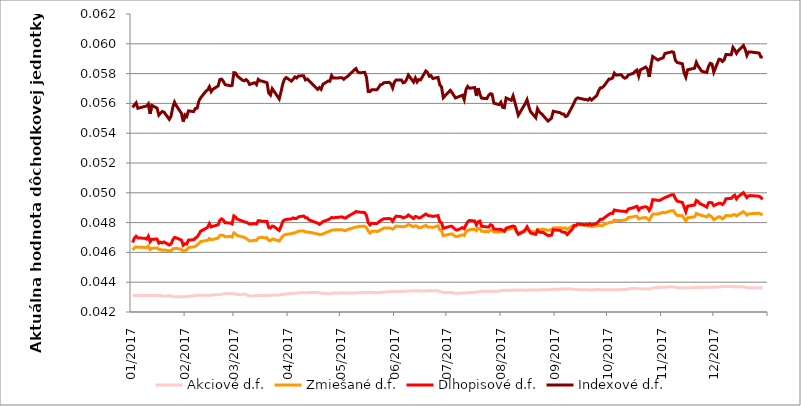
| Category | Akciové d.f. | Zmiešané d.f. | Dlhopisové d.f. | Indexové d.f. |
|---|---|---|---|---|
| 2017-01-02 | 0.043 | 0.046 | 0.047 | 0.056 |
| 2017-01-03 | 0.043 | 0.046 | 0.047 | 0.056 |
| 2017-01-04 | 0.043 | 0.046 | 0.047 | 0.056 |
| 2017-01-05 | 0.043 | 0.046 | 0.047 | 0.056 |
| 2017-01-09 | 0.043 | 0.046 | 0.047 | 0.056 |
| 2017-01-10 | 0.043 | 0.046 | 0.047 | 0.056 |
| 2017-01-11 | 0.043 | 0.046 | 0.047 | 0.056 |
| 2017-01-12 | 0.043 | 0.046 | 0.047 | 0.055 |
| 2017-01-13 | 0.043 | 0.046 | 0.047 | 0.056 |
| 2017-01-16 | 0.043 | 0.046 | 0.047 | 0.056 |
| 2017-01-17 | 0.043 | 0.046 | 0.047 | 0.055 |
| 2017-01-18 | 0.043 | 0.046 | 0.047 | 0.055 |
| 2017-01-19 | 0.043 | 0.046 | 0.047 | 0.055 |
| 2017-01-20 | 0.043 | 0.046 | 0.047 | 0.055 |
| 2017-01-23 | 0.043 | 0.046 | 0.046 | 0.055 |
| 2017-01-24 | 0.043 | 0.046 | 0.047 | 0.055 |
| 2017-01-25 | 0.043 | 0.046 | 0.047 | 0.056 |
| 2017-01-26 | 0.043 | 0.046 | 0.047 | 0.056 |
| 2017-01-27 | 0.043 | 0.046 | 0.047 | 0.056 |
| 2017-01-30 | 0.043 | 0.046 | 0.047 | 0.055 |
| 2017-01-31 | 0.043 | 0.046 | 0.046 | 0.055 |
| 2017-02-01 | 0.043 | 0.046 | 0.047 | 0.055 |
| 2017-02-02 | 0.043 | 0.046 | 0.047 | 0.055 |
| 2017-02-03 | 0.043 | 0.046 | 0.047 | 0.055 |
| 2017-02-06 | 0.043 | 0.046 | 0.047 | 0.055 |
| 2017-02-07 | 0.043 | 0.046 | 0.047 | 0.056 |
| 2017-02-08 | 0.043 | 0.047 | 0.047 | 0.056 |
| 2017-02-09 | 0.043 | 0.047 | 0.047 | 0.056 |
| 2017-02-10 | 0.043 | 0.047 | 0.047 | 0.056 |
| 2017-02-13 | 0.043 | 0.047 | 0.048 | 0.057 |
| 2017-02-14 | 0.043 | 0.047 | 0.048 | 0.057 |
| 2017-02-15 | 0.043 | 0.047 | 0.048 | 0.057 |
| 2017-02-16 | 0.043 | 0.047 | 0.048 | 0.057 |
| 2017-02-17 | 0.043 | 0.047 | 0.048 | 0.057 |
| 2017-02-20 | 0.043 | 0.047 | 0.048 | 0.057 |
| 2017-02-21 | 0.043 | 0.047 | 0.048 | 0.058 |
| 2017-02-22 | 0.043 | 0.047 | 0.048 | 0.058 |
| 2017-02-23 | 0.043 | 0.047 | 0.048 | 0.057 |
| 2017-02-24 | 0.043 | 0.047 | 0.048 | 0.057 |
| 2017-02-27 | 0.043 | 0.047 | 0.048 | 0.057 |
| 2017-02-28 | 0.043 | 0.047 | 0.048 | 0.057 |
| 2017-03-01 | 0.043 | 0.047 | 0.048 | 0.058 |
| 2017-03-02 | 0.043 | 0.047 | 0.048 | 0.058 |
| 2017-03-03 | 0.043 | 0.047 | 0.048 | 0.058 |
| 2017-03-06 | 0.043 | 0.047 | 0.048 | 0.058 |
| 2017-03-07 | 0.043 | 0.047 | 0.048 | 0.058 |
| 2017-03-08 | 0.043 | 0.047 | 0.048 | 0.058 |
| 2017-03-09 | 0.043 | 0.047 | 0.048 | 0.057 |
| 2017-03-10 | 0.043 | 0.047 | 0.048 | 0.057 |
| 2017-03-13 | 0.043 | 0.047 | 0.048 | 0.057 |
| 2017-03-14 | 0.043 | 0.047 | 0.048 | 0.057 |
| 2017-03-15 | 0.043 | 0.047 | 0.048 | 0.058 |
| 2017-03-16 | 0.043 | 0.047 | 0.048 | 0.058 |
| 2017-03-17 | 0.043 | 0.047 | 0.048 | 0.058 |
| 2017-03-20 | 0.043 | 0.047 | 0.048 | 0.057 |
| 2017-03-21 | 0.043 | 0.047 | 0.048 | 0.057 |
| 2017-03-22 | 0.043 | 0.047 | 0.048 | 0.057 |
| 2017-03-23 | 0.043 | 0.047 | 0.048 | 0.057 |
| 2017-03-24 | 0.043 | 0.047 | 0.048 | 0.057 |
| 2017-03-27 | 0.043 | 0.047 | 0.047 | 0.056 |
| 2017-03-28 | 0.043 | 0.047 | 0.048 | 0.057 |
| 2017-03-29 | 0.043 | 0.047 | 0.048 | 0.057 |
| 2017-03-30 | 0.043 | 0.047 | 0.048 | 0.058 |
| 2017-03-31 | 0.043 | 0.047 | 0.048 | 0.058 |
| 2017-04-03 | 0.043 | 0.047 | 0.048 | 0.057 |
| 2017-04-04 | 0.043 | 0.047 | 0.048 | 0.058 |
| 2017-04-05 | 0.043 | 0.047 | 0.048 | 0.058 |
| 2017-04-06 | 0.043 | 0.047 | 0.048 | 0.058 |
| 2017-04-07 | 0.043 | 0.047 | 0.048 | 0.058 |
| 2017-04-10 | 0.043 | 0.047 | 0.048 | 0.058 |
| 2017-04-11 | 0.043 | 0.047 | 0.048 | 0.058 |
| 2017-04-12 | 0.043 | 0.047 | 0.048 | 0.058 |
| 2017-04-13 | 0.043 | 0.047 | 0.048 | 0.058 |
| 2017-04-18 | 0.043 | 0.047 | 0.048 | 0.057 |
| 2017-04-19 | 0.043 | 0.047 | 0.048 | 0.057 |
| 2017-04-20 | 0.043 | 0.047 | 0.048 | 0.057 |
| 2017-04-21 | 0.043 | 0.047 | 0.048 | 0.057 |
| 2017-04-24 | 0.043 | 0.047 | 0.048 | 0.057 |
| 2017-04-25 | 0.043 | 0.047 | 0.048 | 0.057 |
| 2017-04-26 | 0.043 | 0.047 | 0.048 | 0.058 |
| 2017-04-27 | 0.043 | 0.048 | 0.048 | 0.058 |
| 2017-05-02 | 0.043 | 0.048 | 0.048 | 0.058 |
| 2017-05-03 | 0.043 | 0.047 | 0.048 | 0.058 |
| 2017-05-04 | 0.043 | 0.047 | 0.048 | 0.058 |
| 2017-05-05 | 0.043 | 0.048 | 0.048 | 0.058 |
| 2017-05-09 | 0.043 | 0.048 | 0.049 | 0.058 |
| 2017-05-10 | 0.043 | 0.048 | 0.049 | 0.058 |
| 2017-05-11 | 0.043 | 0.048 | 0.049 | 0.058 |
| 2017-05-12 | 0.043 | 0.048 | 0.049 | 0.058 |
| 2017-05-15 | 0.043 | 0.048 | 0.049 | 0.058 |
| 2017-05-16 | 0.043 | 0.048 | 0.048 | 0.058 |
| 2017-05-17 | 0.043 | 0.047 | 0.048 | 0.057 |
| 2017-05-18 | 0.043 | 0.047 | 0.048 | 0.057 |
| 2017-05-19 | 0.043 | 0.047 | 0.048 | 0.057 |
| 2017-05-22 | 0.043 | 0.047 | 0.048 | 0.057 |
| 2017-05-23 | 0.043 | 0.047 | 0.048 | 0.057 |
| 2017-05-24 | 0.043 | 0.048 | 0.048 | 0.057 |
| 2017-05-25 | 0.043 | 0.048 | 0.048 | 0.057 |
| 2017-05-26 | 0.043 | 0.048 | 0.048 | 0.057 |
| 2017-05-29 | 0.043 | 0.048 | 0.048 | 0.057 |
| 2017-05-30 | 0.043 | 0.048 | 0.048 | 0.057 |
| 2017-05-31 | 0.043 | 0.048 | 0.048 | 0.057 |
| 2017-06-01 | 0.043 | 0.048 | 0.048 | 0.057 |
| 2017-06-02 | 0.043 | 0.048 | 0.048 | 0.058 |
| 2017-06-05 | 0.043 | 0.048 | 0.048 | 0.058 |
| 2017-06-06 | 0.043 | 0.048 | 0.048 | 0.057 |
| 2017-06-07 | 0.043 | 0.048 | 0.048 | 0.057 |
| 2017-06-08 | 0.043 | 0.048 | 0.048 | 0.058 |
| 2017-06-09 | 0.043 | 0.048 | 0.049 | 0.058 |
| 2017-06-12 | 0.043 | 0.048 | 0.048 | 0.057 |
| 2017-06-13 | 0.043 | 0.048 | 0.048 | 0.058 |
| 2017-06-14 | 0.043 | 0.048 | 0.048 | 0.057 |
| 2017-06-15 | 0.043 | 0.048 | 0.048 | 0.058 |
| 2017-06-16 | 0.043 | 0.048 | 0.048 | 0.058 |
| 2017-06-19 | 0.043 | 0.048 | 0.049 | 0.058 |
| 2017-06-20 | 0.043 | 0.048 | 0.048 | 0.058 |
| 2017-06-21 | 0.043 | 0.048 | 0.048 | 0.058 |
| 2017-06-22 | 0.043 | 0.048 | 0.048 | 0.058 |
| 2017-06-23 | 0.043 | 0.048 | 0.048 | 0.058 |
| 2017-06-26 | 0.043 | 0.048 | 0.048 | 0.058 |
| 2017-06-27 | 0.043 | 0.048 | 0.048 | 0.057 |
| 2017-06-28 | 0.043 | 0.047 | 0.048 | 0.057 |
| 2017-06-29 | 0.043 | 0.047 | 0.048 | 0.056 |
| 2017-07-03 | 0.043 | 0.047 | 0.048 | 0.057 |
| 2017-07-04 | 0.043 | 0.047 | 0.048 | 0.057 |
| 2017-07-06 | 0.043 | 0.047 | 0.048 | 0.056 |
| 2017-07-07 | 0.043 | 0.047 | 0.047 | 0.056 |
| 2017-07-10 | 0.043 | 0.047 | 0.048 | 0.057 |
| 2017-07-11 | 0.043 | 0.047 | 0.048 | 0.056 |
| 2017-07-12 | 0.043 | 0.047 | 0.048 | 0.057 |
| 2017-07-13 | 0.043 | 0.047 | 0.048 | 0.057 |
| 2017-07-14 | 0.043 | 0.048 | 0.048 | 0.057 |
| 2017-07-17 | 0.043 | 0.048 | 0.048 | 0.057 |
| 2017-07-18 | 0.043 | 0.047 | 0.048 | 0.057 |
| 2017-07-19 | 0.043 | 0.048 | 0.048 | 0.057 |
| 2017-07-20 | 0.043 | 0.048 | 0.048 | 0.057 |
| 2017-07-21 | 0.043 | 0.047 | 0.048 | 0.056 |
| 2017-07-24 | 0.043 | 0.047 | 0.048 | 0.056 |
| 2017-07-25 | 0.043 | 0.047 | 0.048 | 0.057 |
| 2017-07-26 | 0.043 | 0.047 | 0.048 | 0.057 |
| 2017-07-27 | 0.043 | 0.047 | 0.048 | 0.057 |
| 2017-07-28 | 0.043 | 0.047 | 0.048 | 0.056 |
| 2017-07-31 | 0.043 | 0.047 | 0.048 | 0.056 |
| 2017-08-01 | 0.043 | 0.047 | 0.048 | 0.056 |
| 2017-08-02 | 0.043 | 0.047 | 0.047 | 0.056 |
| 2017-08-03 | 0.043 | 0.047 | 0.047 | 0.056 |
| 2017-08-04 | 0.043 | 0.048 | 0.048 | 0.056 |
| 2017-08-07 | 0.043 | 0.048 | 0.048 | 0.056 |
| 2017-08-08 | 0.043 | 0.048 | 0.048 | 0.057 |
| 2017-08-09 | 0.043 | 0.048 | 0.048 | 0.056 |
| 2017-08-10 | 0.043 | 0.047 | 0.047 | 0.056 |
| 2017-08-11 | 0.043 | 0.047 | 0.047 | 0.055 |
| 2017-08-14 | 0.043 | 0.047 | 0.047 | 0.056 |
| 2017-08-15 | 0.043 | 0.047 | 0.048 | 0.056 |
| 2017-08-16 | 0.043 | 0.048 | 0.048 | 0.056 |
| 2017-08-17 | 0.043 | 0.047 | 0.047 | 0.056 |
| 2017-08-18 | 0.043 | 0.047 | 0.047 | 0.055 |
| 2017-08-21 | 0.043 | 0.047 | 0.047 | 0.055 |
| 2017-08-22 | 0.043 | 0.048 | 0.047 | 0.056 |
| 2017-08-23 | 0.043 | 0.047 | 0.047 | 0.055 |
| 2017-08-24 | 0.043 | 0.048 | 0.047 | 0.055 |
| 2017-08-25 | 0.043 | 0.048 | 0.047 | 0.055 |
| 2017-08-28 | 0.043 | 0.047 | 0.047 | 0.055 |
| 2017-08-30 | 0.044 | 0.048 | 0.047 | 0.055 |
| 2017-08-31 | 0.044 | 0.048 | 0.048 | 0.055 |
| 2017-09-04 | 0.044 | 0.048 | 0.047 | 0.055 |
| 2017-09-05 | 0.044 | 0.048 | 0.047 | 0.055 |
| 2017-09-06 | 0.044 | 0.048 | 0.047 | 0.055 |
| 2017-09-07 | 0.044 | 0.048 | 0.047 | 0.055 |
| 2017-09-08 | 0.044 | 0.048 | 0.047 | 0.055 |
| 2017-09-11 | 0.044 | 0.048 | 0.048 | 0.056 |
| 2017-09-12 | 0.044 | 0.048 | 0.048 | 0.056 |
| 2017-09-13 | 0.044 | 0.048 | 0.048 | 0.056 |
| 2017-09-14 | 0.044 | 0.048 | 0.048 | 0.056 |
| 2017-09-18 | 0.043 | 0.048 | 0.048 | 0.056 |
| 2017-09-19 | 0.043 | 0.048 | 0.048 | 0.056 |
| 2017-09-20 | 0.043 | 0.048 | 0.048 | 0.056 |
| 2017-09-21 | 0.043 | 0.048 | 0.048 | 0.056 |
| 2017-09-22 | 0.043 | 0.048 | 0.048 | 0.056 |
| 2017-09-25 | 0.044 | 0.048 | 0.048 | 0.057 |
| 2017-09-26 | 0.044 | 0.048 | 0.048 | 0.057 |
| 2017-09-27 | 0.043 | 0.048 | 0.048 | 0.057 |
| 2017-09-28 | 0.043 | 0.048 | 0.048 | 0.057 |
| 2017-09-29 | 0.043 | 0.048 | 0.048 | 0.057 |
| 2017-10-02 | 0.043 | 0.048 | 0.049 | 0.058 |
| 2017-10-03 | 0.043 | 0.048 | 0.049 | 0.058 |
| 2017-10-04 | 0.043 | 0.048 | 0.049 | 0.058 |
| 2017-10-05 | 0.044 | 0.048 | 0.049 | 0.058 |
| 2017-10-06 | 0.043 | 0.048 | 0.049 | 0.058 |
| 2017-10-09 | 0.044 | 0.048 | 0.049 | 0.058 |
| 2017-10-10 | 0.044 | 0.048 | 0.049 | 0.058 |
| 2017-10-11 | 0.044 | 0.048 | 0.049 | 0.058 |
| 2017-10-12 | 0.044 | 0.048 | 0.049 | 0.058 |
| 2017-10-13 | 0.044 | 0.048 | 0.049 | 0.058 |
| 2017-10-16 | 0.044 | 0.048 | 0.049 | 0.058 |
| 2017-10-17 | 0.044 | 0.048 | 0.049 | 0.058 |
| 2017-10-18 | 0.044 | 0.048 | 0.049 | 0.058 |
| 2017-10-19 | 0.044 | 0.048 | 0.049 | 0.058 |
| 2017-10-20 | 0.044 | 0.048 | 0.049 | 0.058 |
| 2017-10-23 | 0.044 | 0.048 | 0.049 | 0.058 |
| 2017-10-24 | 0.044 | 0.048 | 0.049 | 0.058 |
| 2017-10-25 | 0.044 | 0.048 | 0.049 | 0.058 |
| 2017-10-26 | 0.044 | 0.048 | 0.049 | 0.059 |
| 2017-10-27 | 0.044 | 0.049 | 0.05 | 0.059 |
| 2017-10-30 | 0.044 | 0.049 | 0.049 | 0.059 |
| 2017-10-31 | 0.044 | 0.049 | 0.049 | 0.059 |
| 2017-11-02 | 0.044 | 0.049 | 0.05 | 0.059 |
| 2017-11-03 | 0.044 | 0.049 | 0.05 | 0.059 |
| 2017-11-06 | 0.044 | 0.049 | 0.05 | 0.059 |
| 2017-11-07 | 0.044 | 0.049 | 0.05 | 0.059 |
| 2017-11-08 | 0.044 | 0.049 | 0.05 | 0.059 |
| 2017-11-09 | 0.044 | 0.049 | 0.05 | 0.059 |
| 2017-11-10 | 0.044 | 0.048 | 0.049 | 0.059 |
| 2017-11-13 | 0.044 | 0.048 | 0.049 | 0.059 |
| 2017-11-14 | 0.044 | 0.048 | 0.049 | 0.058 |
| 2017-11-15 | 0.044 | 0.048 | 0.049 | 0.058 |
| 2017-11-16 | 0.044 | 0.048 | 0.049 | 0.058 |
| 2017-11-20 | 0.044 | 0.048 | 0.049 | 0.058 |
| 2017-11-21 | 0.044 | 0.049 | 0.049 | 0.059 |
| 2017-11-22 | 0.044 | 0.049 | 0.049 | 0.059 |
| 2017-11-23 | 0.044 | 0.049 | 0.049 | 0.058 |
| 2017-11-24 | 0.044 | 0.048 | 0.049 | 0.058 |
| 2017-11-27 | 0.044 | 0.048 | 0.049 | 0.058 |
| 2017-11-28 | 0.044 | 0.049 | 0.049 | 0.058 |
| 2017-11-29 | 0.044 | 0.048 | 0.049 | 0.059 |
| 2017-11-30 | 0.044 | 0.048 | 0.049 | 0.059 |
| 2017-12-01 | 0.044 | 0.048 | 0.049 | 0.058 |
| 2017-12-04 | 0.044 | 0.048 | 0.049 | 0.059 |
| 2017-12-05 | 0.044 | 0.048 | 0.049 | 0.059 |
| 2017-12-06 | 0.044 | 0.048 | 0.049 | 0.059 |
| 2017-12-07 | 0.044 | 0.048 | 0.049 | 0.059 |
| 2017-12-08 | 0.044 | 0.048 | 0.05 | 0.059 |
| 2017-12-11 | 0.044 | 0.048 | 0.05 | 0.059 |
| 2017-12-12 | 0.044 | 0.049 | 0.05 | 0.06 |
| 2017-12-13 | 0.044 | 0.049 | 0.05 | 0.06 |
| 2017-12-14 | 0.044 | 0.048 | 0.05 | 0.059 |
| 2017-12-15 | 0.044 | 0.049 | 0.05 | 0.06 |
| 2017-12-18 | 0.044 | 0.049 | 0.05 | 0.06 |
| 2017-12-19 | 0.044 | 0.049 | 0.05 | 0.06 |
| 2017-12-20 | 0.044 | 0.049 | 0.05 | 0.059 |
| 2017-12-21 | 0.044 | 0.049 | 0.05 | 0.059 |
| 2017-12-22 | 0.044 | 0.049 | 0.05 | 0.059 |
| 2017-12-27 | 0.044 | 0.049 | 0.05 | 0.059 |
| 2017-12-28 | 0.044 | 0.049 | 0.05 | 0.059 |
| 2017-12-29 | 0.044 | 0.049 | 0.05 | 0.059 |